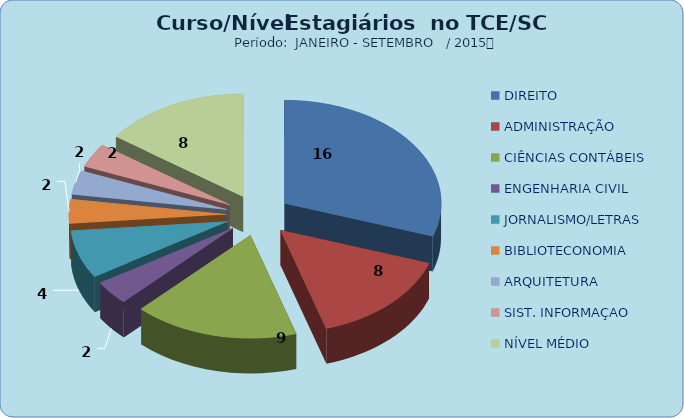
| Category | Series 0 |
|---|---|
| DIREITO | 16 |
| ADMINISTRAÇÃO | 8 |
| CIÊNCIAS CONTÁBEIS | 9 |
| ENGENHARIA CIVIL | 2 |
| JORNALISMO/LETRAS | 4 |
| BIBLIOTECONOMIA | 2 |
| ARQUITETURA | 2 |
| SIST. INFORMAÇAO | 2 |
| NÍVEL MÉDIO | 8 |